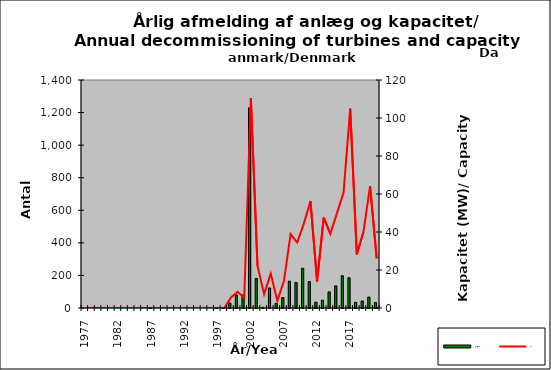
| Category | Antal/No |
|---|---|
| 1977.0 | 0 |
| 1978.0 | 0 |
| 1979.0 | 0 |
| 1980.0 | 0 |
| 1981.0 | 0 |
| 1982.0 | 0 |
| 1983.0 | 0 |
| 1984.0 | 0 |
| 1985.0 | 0 |
| 1986.0 | 0 |
| 1987.0 | 1 |
| 1988.0 | 0 |
| 1989.0 | 0 |
| 1990.0 | 0 |
| 1991.0 | 0 |
| 1992.0 | 0 |
| 1993.0 | 0 |
| 1994.0 | 0 |
| 1995.0 | 0 |
| 1996.0 | 0 |
| 1997.0 | 1 |
| 1998.0 | 3 |
| 1999.0 | 31 |
| 2000.0 | 80 |
| 2001.0 | 80 |
| 2002.0 | 1229 |
| 2003.0 | 182 |
| 2004.0 | 4 |
| 2005.0 | 123 |
| 2006.0 | 28 |
| 2007.0 | 64 |
| 2008.0 | 165 |
| 2009.0 | 157 |
| 2010.0 | 244 |
| 2011.0 | 162 |
| 2012.0 | 36 |
| 2013.0 | 48 |
| 2014.0 | 99 |
| 2015.0 | 136 |
| 2016.0 | 198 |
| 2017.0 | 186 |
| 2018.0 | 35 |
| 2019.0 | 43 |
| 2020.0 | 67 |